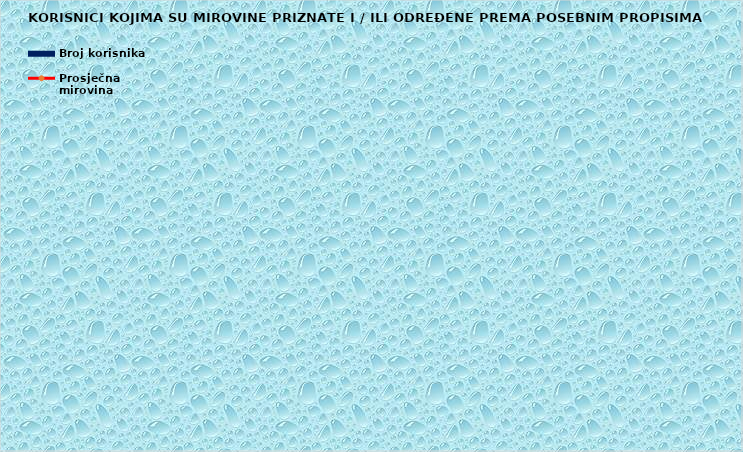
| Category | Broj korisnika |
|---|---|
|      a) radnici na poslovima ovlaštenih službenih osoba u tijelima unutarnjih 
poslova i pravosuđa, kojima je pravo na mirovinu priznato prema propisima
koji su bili na snazi do stupanja na snagu Zakona o pravima iz mirovinskog
osiguranja DVO, PS i OSO | 8293 |
|      b) radnici na  poslovima policijskih službenika, ovlaštenih službenih osoba pravosuđa i službene osobe s posebnim dužnostima i ovlastima u sigurnosno obavještajnom sustavu RH koji su pravo na mirovinu ostvarili prema Zakonu o pravima DVO, PS i OSO | 8569 |
|      c) radnici na poslovima razminiranja | 586 |
| Korisnici koji pravo na mirovinu ostvaruju prema Zakonu o vatrogastvu (NN 125/19)* | 59 |
| Djelatne vojne osobe - DVO  | 15839 |
| Pripadnici Hrvatske domovinske vojske od 1941. do 1945. godine | 3516 |
| Bivši politički zatvorenici | 2675 |
| Hrvatski branitelji iz Domovinskog rata - ZOHBDR | 71123 |
| Mirovine priznate prema općim propisima, a određene prema
ZOHBDR - u iz 2017. (čl. 27., 35., 48. i 49. stavak 2.)  | 46202 |
| Pripadnici bivše Jugoslavenske narodne armije - JNA | 5027 |
| Pripadnici bivše Jugoslavenske narodne armije - JNA - čl. 185 ZOMO | 155 |
| Sudionici Narodnooslobodilačkog rata - NOR | 8480 |
| Zastupnici u Hrvatskom saboru, članovi Vlade, suci Ustavnog suda i glavni državni revizor  | 686 |
| Članovi Izvršnog vijeća Sabora, Saveznog izvršnog vijeća i administrativno umirovljeni javni službenici | 89 |
| Bivši službenici u saveznim tijelima bivše SFRJ - članak 38. ZOMO | 29 |
| Redoviti članovi Hrvatske akademije znanosti i umjetnosti - HAZU | 135 |
| Radnici u Istarskim ugljenokopima "Tupljak" d.d. Labin  | 254 |
| Radnici profesionalno izloženi azbestu | 860 |
| Osiguranici - članovi posade broda u međunarodnoj plovidbi i nacionalnoj plovidbi - članak 129. a stavak 2. Pomorskog zakonika | 185 |
| Pripadnici Hrvatskog vijeća obrane  - HVO  | 6757 |